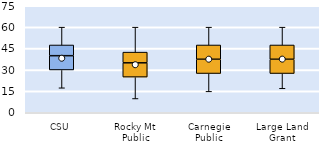
| Category | 25th | 50th | 75th |
|---|---|---|---|
| CSU | 30 | 10 | 7.5 |
| Rocky Mt Public | 25 | 10 | 7.5 |
| Carnegie Public | 27.5 | 10 | 10 |
| Large Land Grant | 27.5 | 10 | 10 |